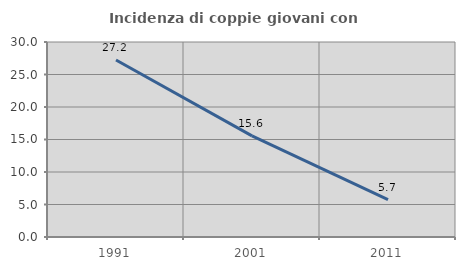
| Category | Incidenza di coppie giovani con figli |
|---|---|
| 1991.0 | 27.236 |
| 2001.0 | 15.556 |
| 2011.0 | 5.747 |